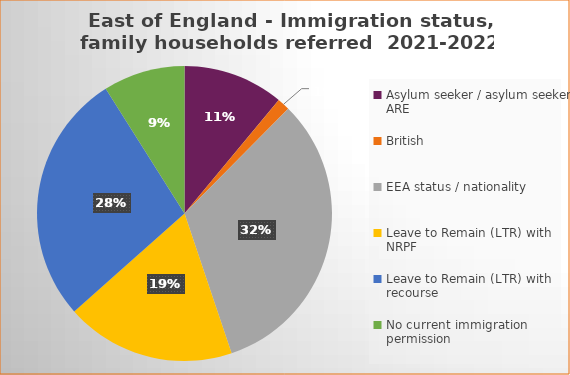
| Category | Number  | Percentage |
|---|---|---|
| Asylum seeker / asylum seeker ARE | 16 | 0.11 |
| British | 2 | 0.014 |
| EEA status / nationality  | 47 | 0.324 |
| Leave to Remain (LTR) with NRPF | 27 | 0.186 |
| Leave to Remain (LTR) with recourse | 40 | 0.276 |
| No current immigration permission | 13 | 0.09 |